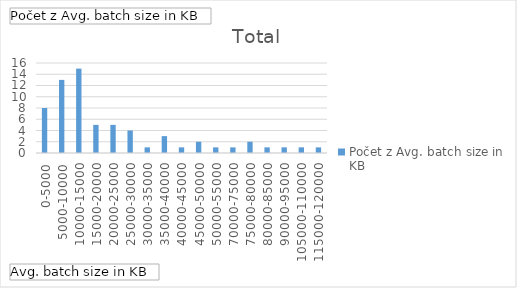
| Category | Celkem |
|---|---|
| 0-5000 | 8 |
| 5000-10000 | 13 |
| 10000-15000 | 15 |
| 15000-20000 | 5 |
| 20000-25000 | 5 |
| 25000-30000 | 4 |
| 30000-35000 | 1 |
| 35000-40000 | 3 |
| 40000-45000 | 1 |
| 45000-50000 | 2 |
| 50000-55000 | 1 |
| 70000-75000 | 1 |
| 75000-80000 | 2 |
| 80000-85000 | 1 |
| 90000-95000 | 1 |
| 105000-110000 | 1 |
| 115000-120000 | 1 |